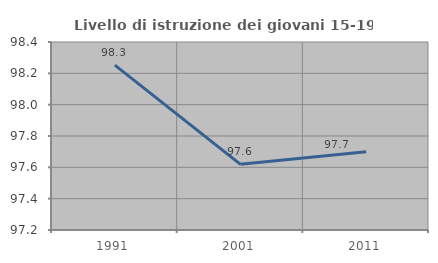
| Category | Livello di istruzione dei giovani 15-19 anni |
|---|---|
| 1991.0 | 98.252 |
| 2001.0 | 97.619 |
| 2011.0 | 97.699 |